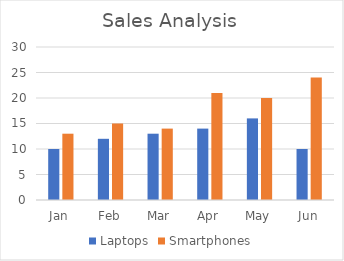
| Category | Laptops | Smartphones |
|---|---|---|
| Jan | 10 | 13 |
| Feb | 12 | 15 |
| Mar | 13 | 14 |
| Apr | 14 | 21 |
| May | 16 | 20 |
| Jun | 10 | 24 |